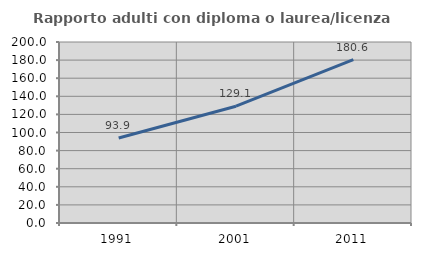
| Category | Rapporto adulti con diploma o laurea/licenza media  |
|---|---|
| 1991.0 | 93.878 |
| 2001.0 | 129.07 |
| 2011.0 | 180.556 |